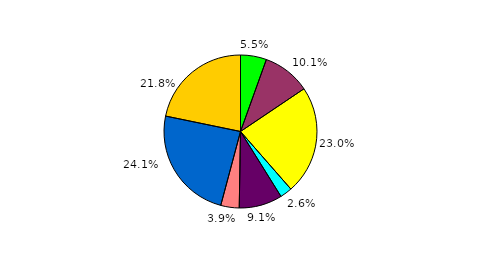
| Category | Series 0 |
|---|---|
| 0 | 5.494 |
| 1 | 10.082 |
| 2 | 22.985 |
| 3 | 2.568 |
| 4 | 9.135 |
| 5 | 3.894 |
| 6 | 24.079 |
| 7 | 21.764 |